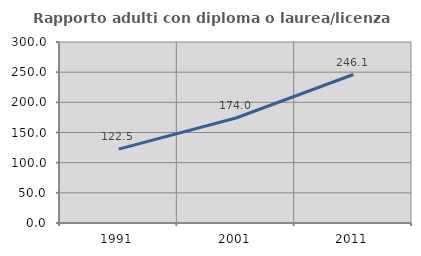
| Category | Rapporto adulti con diploma o laurea/licenza media  |
|---|---|
| 1991.0 | 122.527 |
| 2001.0 | 174.022 |
| 2011.0 | 246.115 |